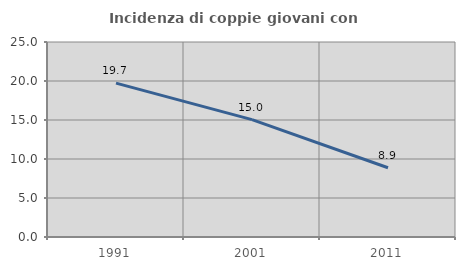
| Category | Incidenza di coppie giovani con figli |
|---|---|
| 1991.0 | 19.728 |
| 2001.0 | 15.049 |
| 2011.0 | 8.878 |